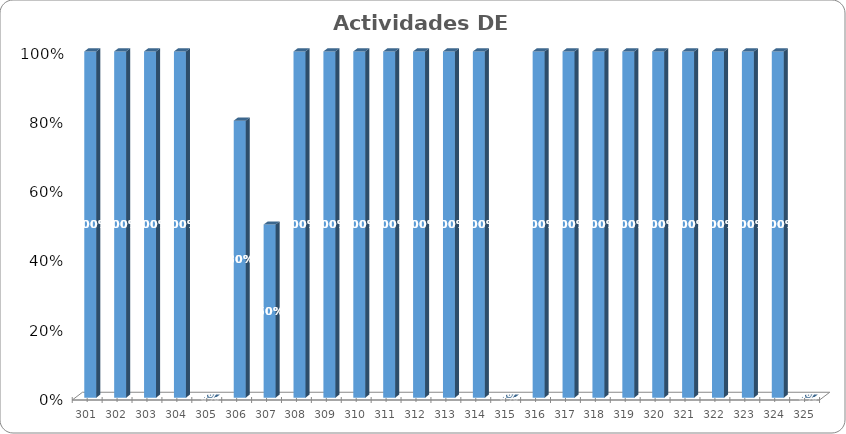
| Category | % Avance |
|---|---|
| 301.0 | 1 |
| 302.0 | 1 |
| 303.0 | 1 |
| 304.0 | 1 |
| 305.0 | 0 |
| 306.0 | 0.8 |
| 307.0 | 0.5 |
| 308.0 | 1 |
| 309.0 | 1 |
| 310.0 | 1 |
| 311.0 | 1 |
| 312.0 | 1 |
| 313.0 | 1 |
| 314.0 | 1 |
| 315.0 | 0 |
| 316.0 | 1 |
| 317.0 | 1 |
| 318.0 | 1 |
| 319.0 | 1 |
| 320.0 | 1 |
| 321.0 | 1 |
| 322.0 | 1 |
| 323.0 | 1 |
| 324.0 | 1 |
| 325.0 | 0 |